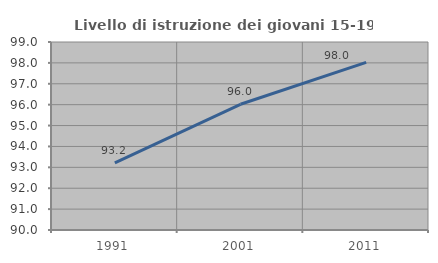
| Category | Livello di istruzione dei giovani 15-19 anni |
|---|---|
| 1991.0 | 93.213 |
| 2001.0 | 96.019 |
| 2011.0 | 98.025 |